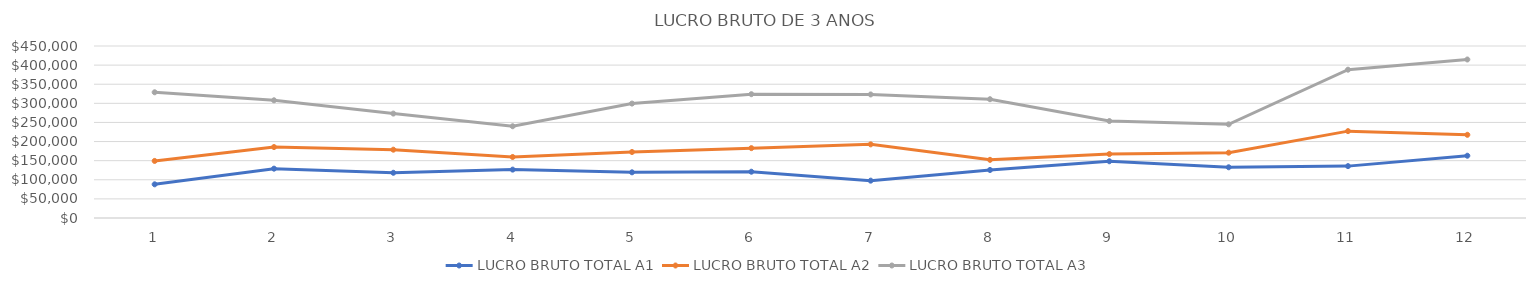
| Category | LUCRO BRUTO TOTAL A1 | LUCRO BRUTO TOTAL A2 | LUCRO BRUTO TOTAL A3 |
|---|---|---|---|
| 0 | 88114 | 149299.8 | 328920.1 |
| 1 | 129087 | 185572.05 | 307938.2 |
| 2 | 118320 | 178734.75 | 273173.6 |
| 3 | 126600 | 159643.5 | 240058.1 |
| 4 | 119528 | 172671.8 | 299376.2 |
| 5 | 121091.5 | 182784.4 | 323907 |
| 6 | 97705.5 | 192648.75 | 323256.1 |
| 7 | 125637 | 152163.2 | 310748.5 |
| 8 | 148434 | 167284.6 | 253671.3 |
| 9 | 132710 | 170910.05 | 245075.1 |
| 10 | 135723 | 227271.75 | 388017.1 |
| 11 | 162928 | 217656 | 414703.8 |